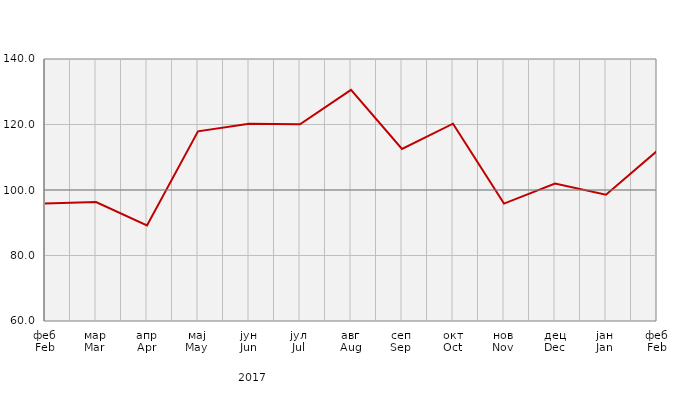
| Category | Индекси ноћења туриста
Tourist night indices |
|---|---|
| феб
Feb | 95.907 |
| мар
Mar | 96.311 |
| апр
Apr | 89.193 |
| мај
May | 117.906 |
| јун
Jun | 120.259 |
| јул
Jul | 120.08 |
| авг
Aug | 130.596 |
| сеп
Sep | 112.544 |
| окт
Oct | 120.238 |
| нов
Nov | 95.857 |
| дец
Dec | 101.993 |
| јан
Jan | 98.549 |
| феб
Feb | 111.894 |